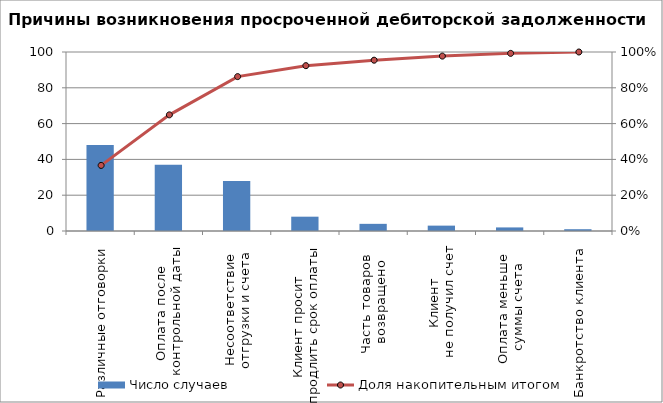
| Category | Число случаев |
|---|---|
| Различные отговорки | 48 |
| Оплата после 
контрольной даты | 37 |
| Несоответствие 
отгрузки и счета  | 28 |
| Клиент просит 
продлить срок оплаты | 8 |
| Часть товаров 
возвращено | 4 |
| Клиент 
не получил счет | 3 |
| Оплата меньше 
суммы счета | 2 |
| Банкротство клиента | 1 |